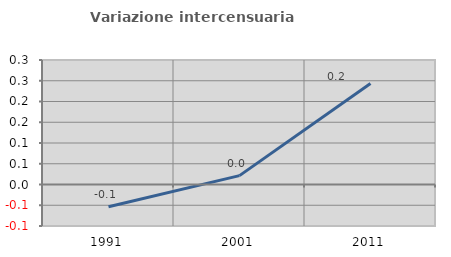
| Category | Variazione intercensuaria annua |
|---|---|
| 1991.0 | -0.053 |
| 2001.0 | 0.021 |
| 2011.0 | 0.244 |